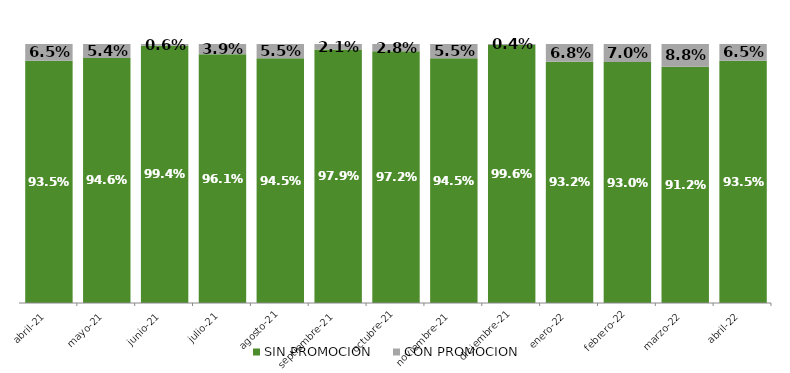
| Category | SIN PROMOCION   | CON PROMOCION   |
|---|---|---|
| 2021-04-01 | 0.935 | 0.065 |
| 2021-05-01 | 0.946 | 0.054 |
| 2021-06-01 | 0.994 | 0.006 |
| 2021-07-01 | 0.961 | 0.039 |
| 2021-08-01 | 0.945 | 0.055 |
| 2021-09-01 | 0.979 | 0.021 |
| 2021-10-01 | 0.972 | 0.028 |
| 2021-11-01 | 0.945 | 0.055 |
| 2021-12-01 | 0.996 | 0.004 |
| 2022-01-01 | 0.932 | 0.068 |
| 2022-02-01 | 0.93 | 0.07 |
| 2022-03-01 | 0.912 | 0.088 |
| 2022-04-01 | 0.935 | 0.065 |